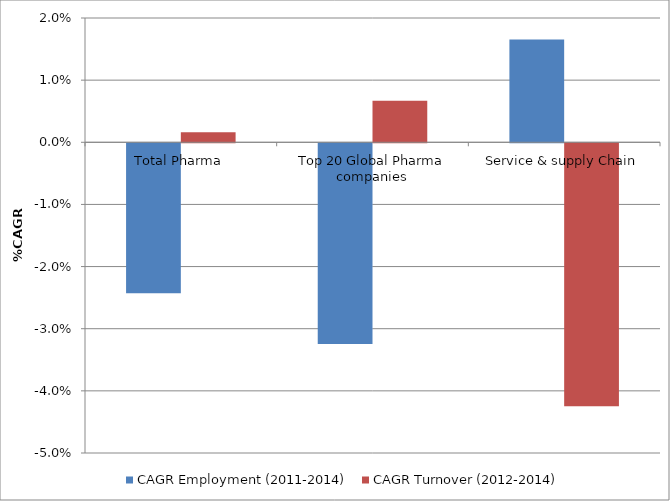
| Category | CAGR Employment (2011-2014) | CAGR Turnover (2012-2014) |
|---|---|---|
| Total Pharma | -0.024 | 0.002 |
| Top 20 Global Pharma companies | -0.032 | 0.007 |
| Service & supply Chain | 0.017 | -0.042 |